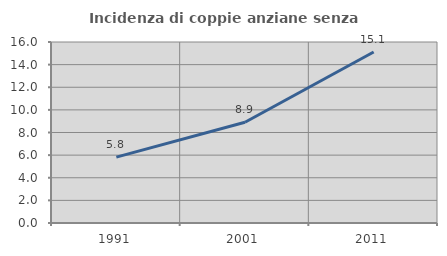
| Category | Incidenza di coppie anziane senza figli  |
|---|---|
| 1991.0 | 5.819 |
| 2001.0 | 8.903 |
| 2011.0 | 15.114 |